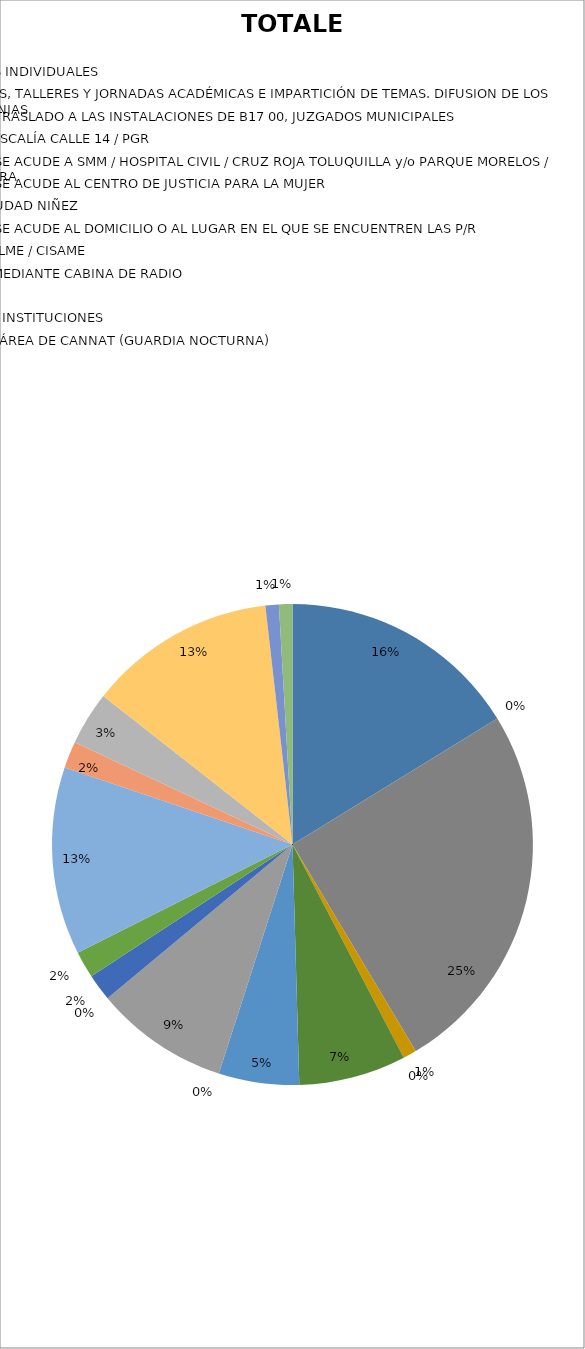
| Category | TOTALES |
|---|---|
| ASESORIAS JURÍDICAS | 18 |
| TERAPIAS PSICOLÓGICAS INDIVIDUALES | 0 |
| ACUDIR A CONFERENCIAS, TALLERES Y JORNADAS ACADÉMICAS E IMPARTICIÓN DE TEMAS. DIFUSION DE LOS SERVICIOS EN LAS COLONIAS | 28 |
| ACOMPAÑAMIENTO Y/O TRASLADO A LAS INSTALACIONES DE B17 00, JUZGADOS MUNICIPALES | 1 |
| ACOMPAÑAMIENTOS A FISCALÍA CALLE 14 / PGR | 0 |
| ACOMPAÑAMIENTO Y/O SE ACUDE A SMM / HOSPITAL CIVIL / CRUZ ROJA TOLUQUILLA y/o PARQUE MORELOS / IJCF / CENTRAL CAMIONERA | 8 |
| ACOMPAÑAMIENTO Y/O SE ACUDE AL CENTRO DE JUSTICIA PARA LA MUJER | 6 |
| ACOMPAÑAMIENTO A CIUDAD NIÑEZ  | 0 |
| ACOMPAÑAMIENTO Y/O SE ACUDE AL DOMICILIO O AL LUGAR EN EL QUE SE ENCUENTREN LAS P/R | 10 |
| ACOMPAÑAMIENTO A SALME / CISAME | 0 |
| SERVICIOS DERIVADOS MEDIANTE CABINA DE RADIO | 2 |
| CANALIZACIÓN INTERNA | 2 |
| CANALIZACIÓN A OTRAS INSTITUCIONES | 14 |
| COLABORACIÓN CON EL ÁREA DE CANNAT (GUARDIA NOCTURNA) | 2 |
| VISITAS DOMICILIARIAS  | 4 |
| VISITAS DOMICILIARIAS DE NOTIFICACIONES DE LAS ORDENES DE PROTECCIÓN A DENUNCIADOS | 14 |
| ATENCIONES Y AUXILIO PSICOLÓGICO | 1 |
| ENTREGA DE DISPOSITIVO "PULSO DE VIDA" | 1 |